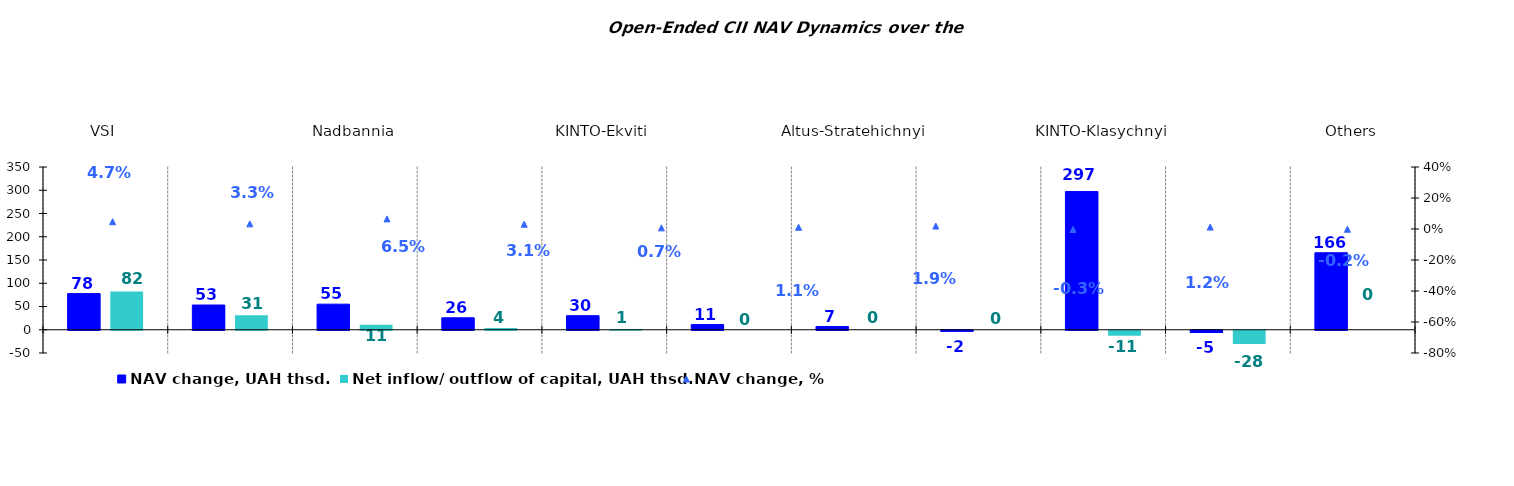
| Category | NAV change, UAH thsd. | Net inflow/ outflow of capital, UAH thsd. |
|---|---|---|
| VSI | 77.727 | 82.112 |
| KINTO- Kaznacheiskyi | 53.18 | 31.271 |
| Nadbannia | 55.019 | 10.901 |
| UNIVER.UA/Iaroslav Mudryi: Fond Aktsii | 25.719 | 3.625 |
| KINTO-Ekviti | 30.265 | 0.909 |
| ТАSK Resurs | 11.094 | 0 |
| Altus-Stratehichnyi | 6.917 | 0 |
| Bonum Optimum | -2.179 | 0 |
| KINTO-Klasychnyi | 297.392 | -10.918 |
| Altus-Zbalansovanyi | -4.749 | -28.449 |
| Others | 165.613 | 0 |